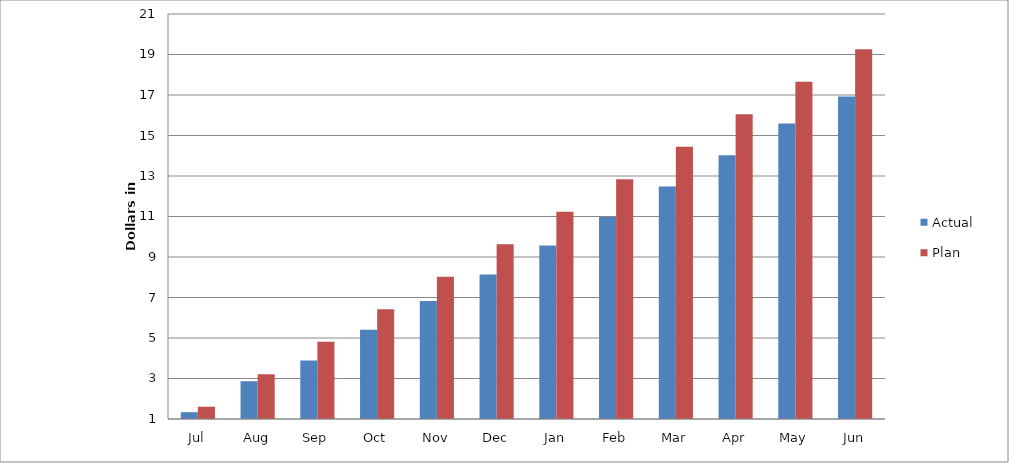
| Category | Actual | Plan |
|---|---|---|
| Jul | 1336905.15 | 1604961.667 |
| Aug | 2865114.64 | 3209923.333 |
| Sep | 3890729.51 | 4814885 |
| Oct | 5410766.89 | 6419846.667 |
| Nov | 6824974.54 | 8024808.333 |
| Dec | 8138204.74 | 9629770 |
| Jan | 9567435.44 | 11234731.667 |
| Feb | 10976841.51 | 12839693.333 |
| Mar | 12487605.78 | 14444655 |
| Apr | 14019814.52 | 16049616.667 |
| May | 15591497.31 | 17654578.333 |
| Jun | 16931184.04 | 19259540 |